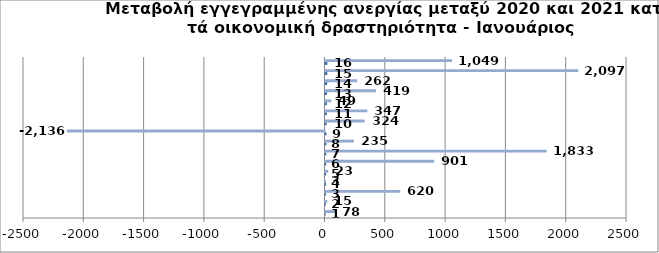
| Category | Series 0 | Series 1 |
|---|---|---|
| 0 | 1 | 78 |
| 1 | 2 | 15 |
| 2 | 3 | 620 |
| 3 | 4 | 3 |
| 4 | 5 | 23 |
| 5 | 6 | 901 |
| 6 | 7 | 1833 |
| 7 | 8 | 235 |
| 8 | 9 | -2136 |
| 9 | 10 | 324 |
| 10 | 11 | 347 |
| 11 | 12 | 49 |
| 12 | 13 | 419 |
| 13 | 14 | 262 |
| 14 | 15 | 2097 |
| 15 | 16 | 1049 |